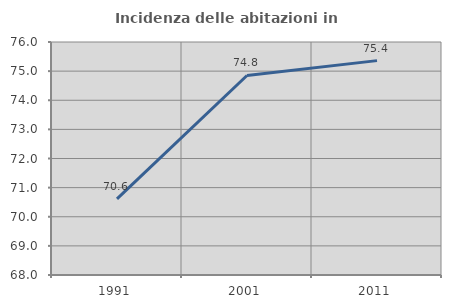
| Category | Incidenza delle abitazioni in proprietà  |
|---|---|
| 1991.0 | 70.616 |
| 2001.0 | 74.85 |
| 2011.0 | 75.36 |